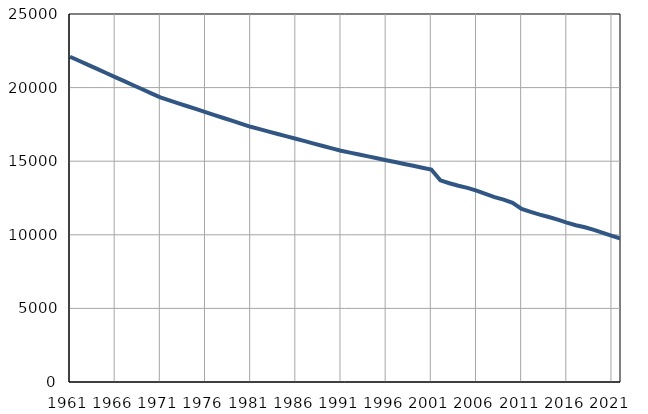
| Category | Population
size |
|---|---|
| 1961.0 | 22099 |
| 1962.0 | 21822 |
| 1963.0 | 21545 |
| 1964.0 | 21269 |
| 1965.0 | 20992 |
| 1966.0 | 20715 |
| 1967.0 | 20438 |
| 1968.0 | 20162 |
| 1969.0 | 19885 |
| 1970.0 | 19608 |
| 1971.0 | 19331 |
| 1972.0 | 19132 |
| 1973.0 | 18932 |
| 1974.0 | 18733 |
| 1975.0 | 18534 |
| 1976.0 | 18335 |
| 1977.0 | 18135 |
| 1978.0 | 17936 |
| 1979.0 | 17737 |
| 1980.0 | 17537 |
| 1981.0 | 17338 |
| 1982.0 | 17175 |
| 1983.0 | 17012 |
| 1984.0 | 16849 |
| 1985.0 | 16686 |
| 1986.0 | 16523 |
| 1987.0 | 16361 |
| 1988.0 | 16198 |
| 1989.0 | 16035 |
| 1990.0 | 15872 |
| 1991.0 | 15709 |
| 1992.0 | 15581 |
| 1993.0 | 15453 |
| 1994.0 | 15326 |
| 1995.0 | 15198 |
| 1996.0 | 15070 |
| 1997.0 | 14942 |
| 1998.0 | 14814 |
| 1999.0 | 14686 |
| 2000.0 | 14559 |
| 2001.0 | 14431 |
| 2002.0 | 13702 |
| 2003.0 | 13503 |
| 2004.0 | 13336 |
| 2005.0 | 13185 |
| 2006.0 | 12995 |
| 2007.0 | 12780 |
| 2008.0 | 12564 |
| 2009.0 | 12386 |
| 2010.0 | 12174 |
| 2011.0 | 11761 |
| 2012.0 | 11557 |
| 2013.0 | 11370 |
| 2014.0 | 11212 |
| 2015.0 | 11035 |
| 2016.0 | 10832 |
| 2017.0 | 10651 |
| 2018.0 | 10509 |
| 2019.0 | 10339 |
| 2020.0 | 10132 |
| 2021.0 | 9925 |
| 2022.0 | 9731 |